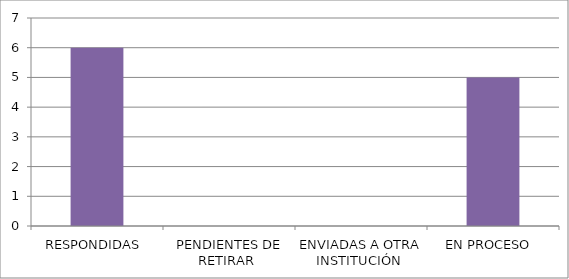
| Category | Series 0 |
|---|---|
| RESPONDIDAS  | 6 |
| PENDIENTES DE RETIRAR  | 0 |
| ENVIADAS A OTRA INSTITUCIÓN  | 0 |
| EN PROCESO  | 5 |